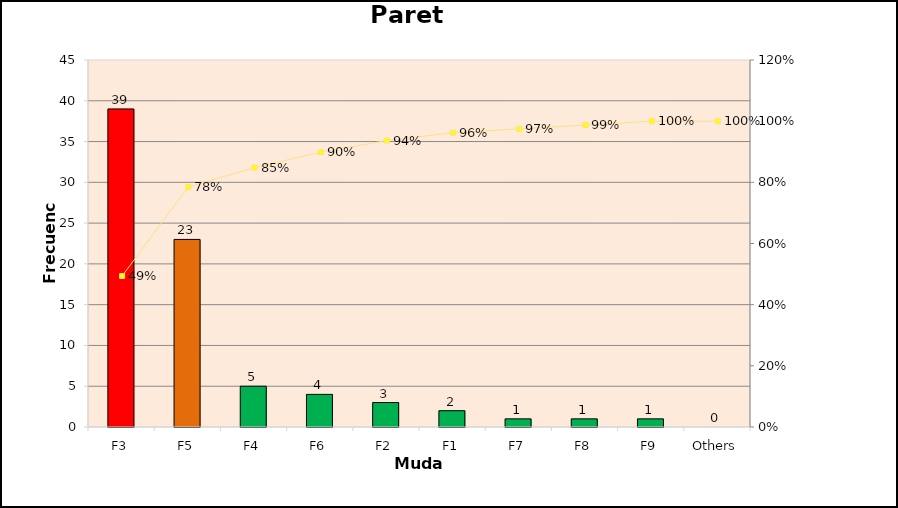
| Category | Series 0 |
|---|---|
| F3 | 39 |
| F5 | 23 |
| F4 | 5 |
| F6 | 4 |
| F2 | 3 |
| F1 | 2 |
| F7 | 1 |
| F8 | 1 |
| F9 | 1 |
| Others | 0 |